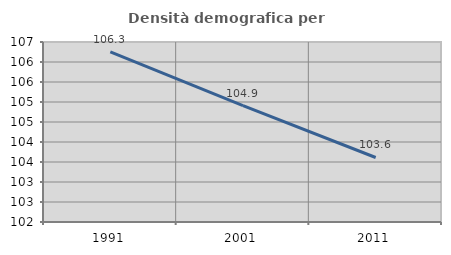
| Category | Densità demografica |
|---|---|
| 1991.0 | 106.251 |
| 2001.0 | 104.911 |
| 2011.0 | 103.613 |